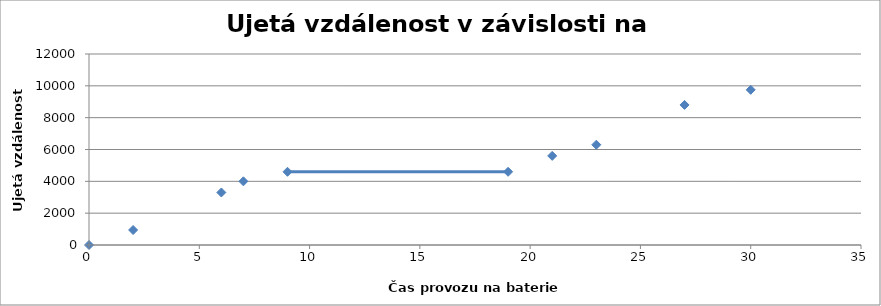
| Category | Series 0 |
|---|---|
| 0.0 | 0 |
| nan | 483 |
| nan | 848 |
| 2.0 | 942 |
| nan | 1200 |
| nan | 1700 |
| nan | 2200 |
| nan | 2700 |
| nan | 3200 |
| 6.0 | 3300 |
| nan | 3800 |
| 7.0 | 4000 |
| nan | 4100 |
| nan | 4400 |
| nan | 4500 |
| 9.0 | 4600 |
| 19.0 | 4600 |
| nan | 4800 |
| nan | 5000 |
| nan | 5100 |
| nan | 5200 |
| nan | 5500 |
| 21.0 | 5600 |
| nan | 5800 |
| 23.0 | 6300 |
| nan | 6400 |
| nan | 6800 |
| nan | 7300 |
| nan | 7800 |
| nan | 8300 |
| 27.0 | 8800 |
| nan | 8850 |
| nan | 9213 |
| nan | 9550 |
| nan | 9600 |
| 30.0 | 9750 |